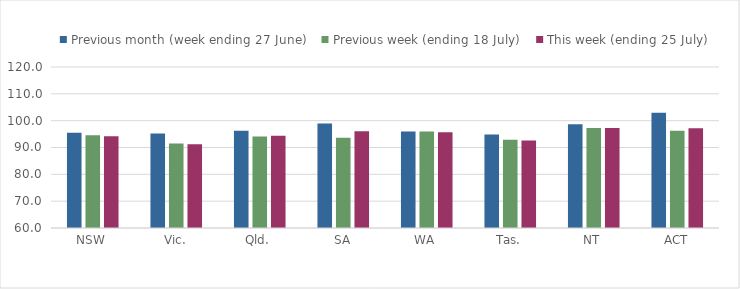
| Category | Previous month (week ending 27 June) | Previous week (ending 18 July) | This week (ending 25 July) |
|---|---|---|---|
| NSW | 95.534 | 94.546 | 94.182 |
| Vic. | 95.193 | 91.517 | 91.207 |
| Qld. | 96.254 | 94.113 | 94.387 |
| SA | 98.916 | 93.59 | 96.068 |
| WA | 95.992 | 95.996 | 95.671 |
| Tas. | 94.848 | 92.89 | 92.642 |
| NT | 98.645 | 97.245 | 97.245 |
| ACT | 102.937 | 96.267 | 97.22 |